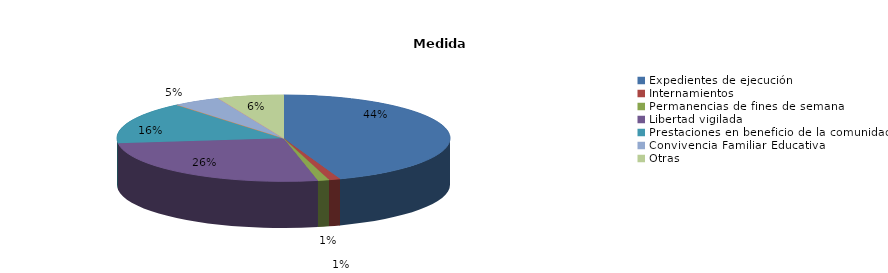
| Category | Series 0 |
|---|---|
| Expedientes de ejecución | 202 |
| Internamientos | 5 |
| Permanencias de fines de semana | 5 |
| Libertad vigilada | 120 |
| Prestaciones en beneficio de la comunidad | 72 |
| Privación de permisos y licencias | 0 |
| Convivencia Familiar Educativa | 21 |
| Amonestaciones | 0 |
| Otras | 29 |